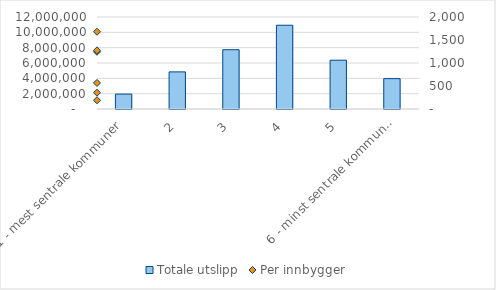
| Category | Totale utslipp |
|---|---|
| 1 - mest sentrale kommuner | 1944180.539 |
| 2 | 4840442.016 |
| 3 | 7733369.244 |
| 4 | 10925436.758 |
| 5 | 6365797.675 |
| 6 - minst sentrale kommuner | 3958208.725 |